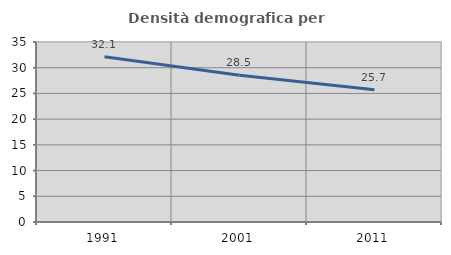
| Category | Densità demografica |
|---|---|
| 1991.0 | 32.12 |
| 2001.0 | 28.526 |
| 2011.0 | 25.73 |